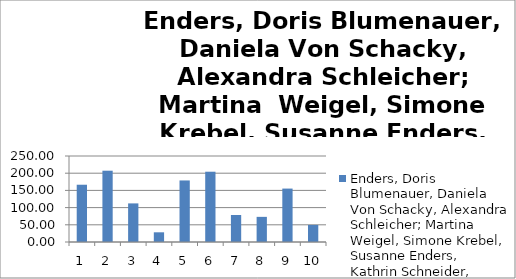
| Category | Enders, Doris Blumenauer, Daniela Von Schacky, Alexandra Schleicher; Martina  Weigel, Simone Krebel, Susanne Enders, Kathrin Schneider, Petra Weiske, Lydia Spörer, Katja |
|---|---|
| 0 | 166.49 |
| 1 | 207.26 |
| 2 | 112.21 |
| 3 | 28.19 |
| 4 | 178.93 |
| 5 | 204.32 |
| 6 | 78.47 |
| 7 | 73.08 |
| 8 | 155.3 |
| 9 | 49.563 |